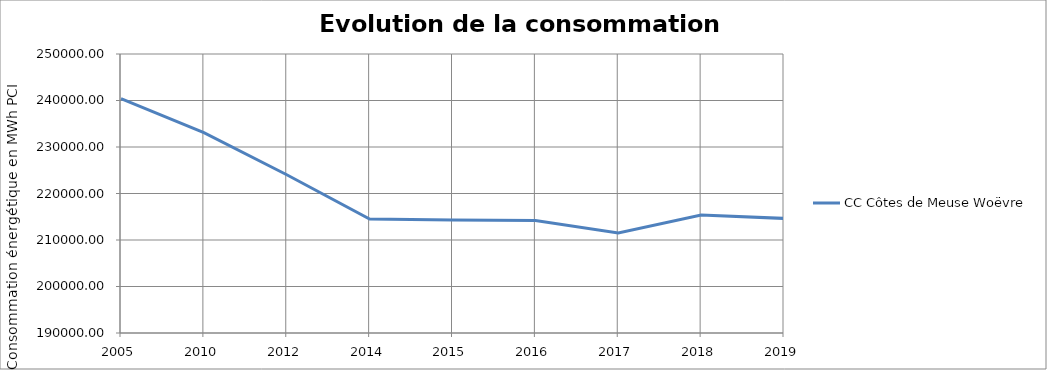
| Category | CC Côtes de Meuse Woëvre |
|---|---|
| 2005.0 | 240407.796 |
| 2010.0 | 233076.069 |
| 2012.0 | 224029.021 |
| 2014.0 | 214513.875 |
| 2015.0 | 214303.908 |
| 2016.0 | 214179.362 |
| 2017.0 | 211496.174 |
| 2018.0 | 215373.774 |
| 2019.0 | 214641.721 |